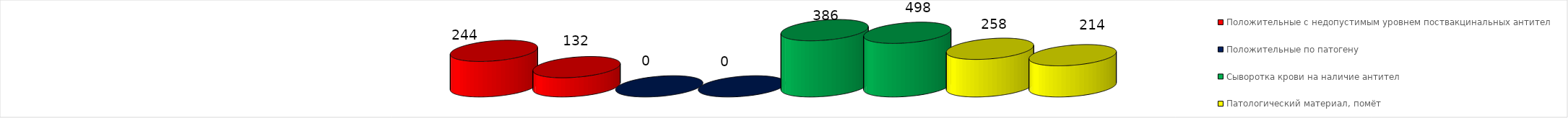
| Category | Положительные с недопустимым уровнем поствакцинальных антител | Положительные по патогену | Сыворотка крови на наличие антител | Патологический материал, помёт |
|---|---|---|---|---|
| Сыворотка крови на наличие антител | 132 | 0 | 368 | 214 |